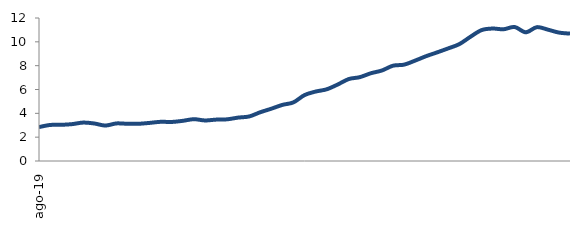
| Category | Series 0 |
|---|---|
| 2019-08-01 | 2.847 |
| 2019-09-01 | 3.023 |
| 2019-10-01 | 3.036 |
| 2019-11-01 | 3.095 |
| 2019-12-01 | 3.225 |
| 2020-01-01 | 3.148 |
| 2020-02-01 | 2.975 |
| 2020-03-01 | 3.153 |
| 2020-04-01 | 3.122 |
| 2020-05-01 | 3.123 |
| 2020-06-01 | 3.198 |
| 2020-07-01 | 3.289 |
| 2020-08-01 | 3.275 |
| 2020-09-01 | 3.372 |
| 2020-10-01 | 3.508 |
| 2020-11-01 | 3.402 |
| 2020-12-01 | 3.472 |
| 2021-01-01 | 3.496 |
| 2021-02-01 | 3.642 |
| 2021-03-01 | 3.737 |
| 2021-04-01 | 4.091 |
| 2021-05-01 | 4.388 |
| 2021-06-01 | 4.708 |
| 2021-07-01 | 4.92 |
| 2021-08-01 | 5.531 |
| 2021-09-01 | 5.826 |
| 2021-10-01 | 6.015 |
| 2021-11-01 | 6.418 |
| 2021-12-01 | 6.877 |
| 2022-01-01 | 7.036 |
| 2022-02-01 | 7.363 |
| 2022-03-01 | 7.597 |
| 2022-04-01 | 7.997 |
| 2022-05-01 | 8.085 |
| 2022-06-01 | 8.423 |
| 2022-07-01 | 8.799 |
| 2022-08-01 | 9.118 |
| 2022-09-01 | 9.453 |
| 2022-10-01 | 9.809 |
| 2022-11-01 | 10.425 |
| 2022-12-01 | 10.982 |
| 2023-01-01 | 11.115 |
| 2023-02-01 | 11.054 |
| 2023-03-01 | 11.245 |
| 2023-04-01 | 10.801 |
| 2023-05-01 | 11.231 |
| 2023-06-01 | 11.022 |
| 2023-07-01 | 10.776 |
| 2023-08-01 | 10.689 |